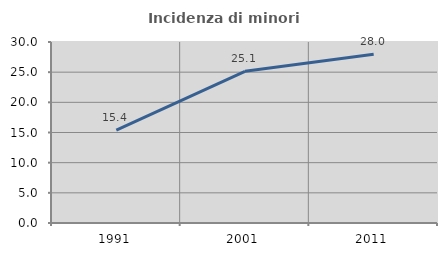
| Category | Incidenza di minori stranieri |
|---|---|
| 1991.0 | 15.385 |
| 2001.0 | 25.134 |
| 2011.0 | 27.975 |